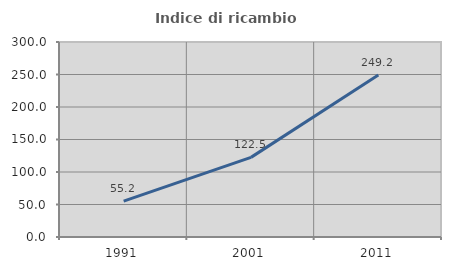
| Category | Indice di ricambio occupazionale  |
|---|---|
| 1991.0 | 55.245 |
| 2001.0 | 122.5 |
| 2011.0 | 249.231 |